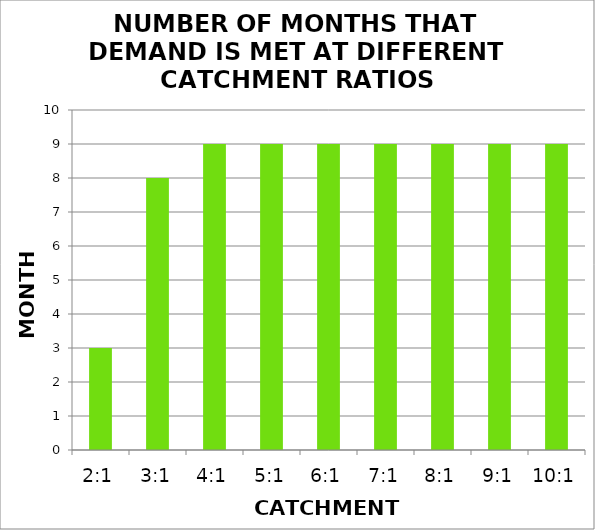
| Category |  NUMBER OF MONTHS THAT DEMAND IS MET AT DIFFERENT CATCHMENT RATIOS |
|---|---|
| 2:1 | 3 |
| 3:1 | 8 |
| 4:1 | 9 |
| 5:1 | 9 |
| 6:1 | 9 |
| 7:1 | 9 |
| 8:1 | 9 |
| 9:1 | 9 |
| 10:1 | 9 |